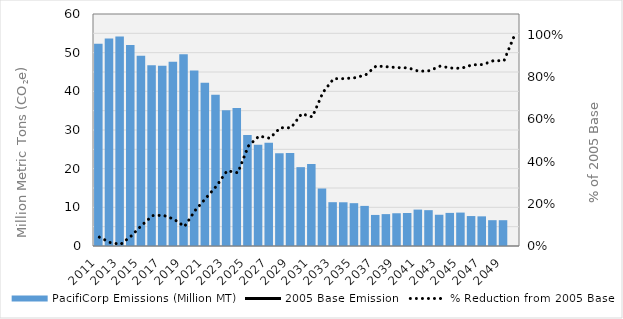
| Category | PacifiCorp Emissions (Million MT) |
|---|---|
| 2011.0 | 52.297 |
| 2012.0 | 53.682 |
| 2013.0 | 54.188 |
| 2014.0 | 51.996 |
| 2015.0 | 49.195 |
| 2016.0 | 46.74 |
| 2017.0 | 46.646 |
| 2018.0 | 47.65 |
| 2019.0 | 49.566 |
| 2020.0 | 45.388 |
| 2021.0 | 42.238 |
| 2022.0 | 39.086 |
| 2023.0 | 35.12 |
| 2024.0 | 35.666 |
| 2025.0 | 28.732 |
| 2026.0 | 26.16 |
| 2027.0 | 26.721 |
| 2028.0 | 24.014 |
| 2029.0 | 24.025 |
| 2030.0 | 20.393 |
| 2031.0 | 21.213 |
| 2032.0 | 14.871 |
| 2033.0 | 11.332 |
| 2034.0 | 11.308 |
| 2035.0 | 11.077 |
| 2036.0 | 10.372 |
| 2037.0 | 8.033 |
| 2038.0 | 8.247 |
| 2039.0 | 8.469 |
| 2040.0 | 8.53 |
| 2041.0 | 9.416 |
| 2042.0 | 9.269 |
| 2043.0 | 8.081 |
| 2044.0 | 8.56 |
| 2045.0 | 8.642 |
| 2046.0 | 7.744 |
| 2047.0 | 7.67 |
| 2048.0 | 6.675 |
| 2049.0 | 6.671 |
| 2050.0 | 0 |